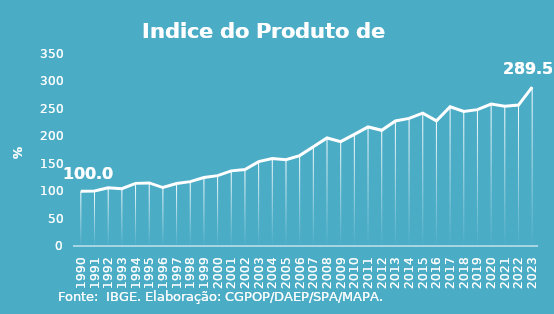
| Category | Indice de Prod. base 1990 |
|---|---|
| 1990.0 | 100 |
| 1991.0 | 100.275 |
| 1992.0 | 106.203 |
| 1993.0 | 104.57 |
| 1994.0 | 114.164 |
| 1995.0 | 115.024 |
| 1996.0 | 106.552 |
| 1997.0 | 114.037 |
| 1998.0 | 117.319 |
| 1999.0 | 124.734 |
| 2000.0 | 128.293 |
| 2001.0 | 136.975 |
| 2002.0 | 139.51 |
| 2003.0 | 153.868 |
| 2004.0 | 159.641 |
| 2005.0 | 157.136 |
| 2006.0 | 164.858 |
| 2007.0 | 180.781 |
| 2008.0 | 196.91 |
| 2009.0 | 190.309 |
| 2010.0 | 203.581 |
| 2011.0 | 217.041 |
| 2012.0 | 210.932 |
| 2013.0 | 228.009 |
| 2014.0 | 232.562 |
| 2015.0 | 242.318 |
| 2016.0 | 228.239 |
| 2017.0 | 253.826 |
| 2018.0 | 245.134 |
| 2019.0 | 248.619 |
| 2020.0 | 258.848 |
| 2021.0 | 254.988 |
| 2022.0 | 256.904 |
| 2023.0 | 289.543 |